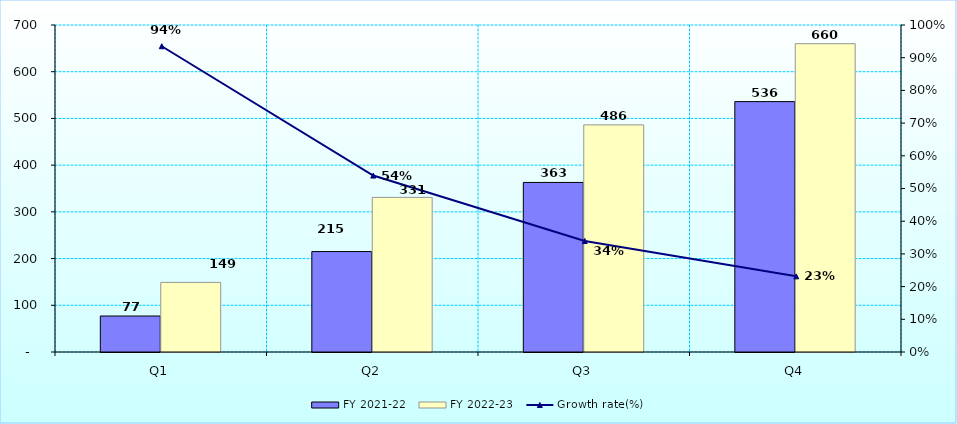
| Category | FY 2021-22 | FY 2022-23 |
|---|---|---|
| Q1 | 77 | 149 |
| Q2 | 215 | 331 |
| Q3 | 363 | 486.214 |
| Q4 | 536 | 660 |